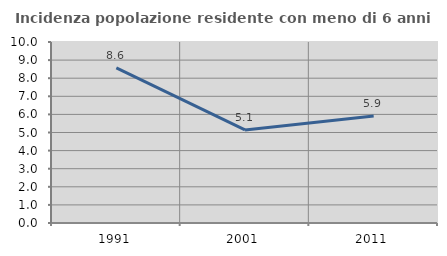
| Category | Incidenza popolazione residente con meno di 6 anni |
|---|---|
| 1991.0 | 8.572 |
| 2001.0 | 5.14 |
| 2011.0 | 5.915 |